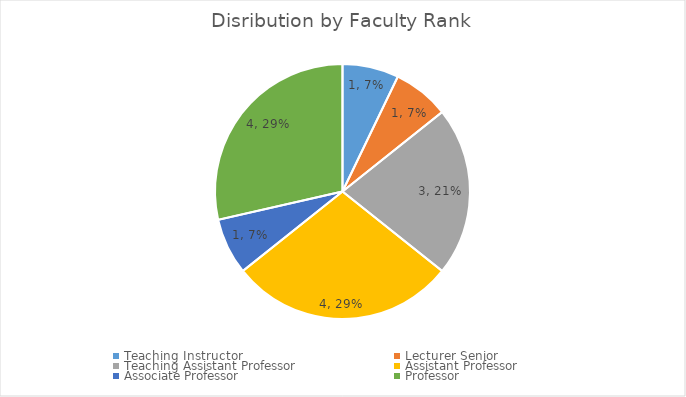
| Category | Series 0 |
|---|---|
| Teaching Instructor | 1 |
| Lecturer Senior | 1 |
| Teaching Assistant Professor | 3 |
| Assistant Professor | 4 |
| Associate Professor | 1 |
| Professor | 4 |